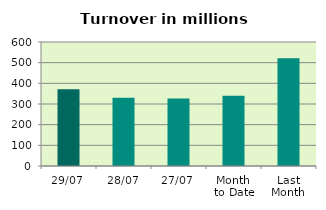
| Category | Series 0 |
|---|---|
| 29/07 | 371.599 |
| 28/07 | 330.029 |
| 27/07 | 326.823 |
| Month 
to Date | 339.497 |
| Last
Month | 521.023 |